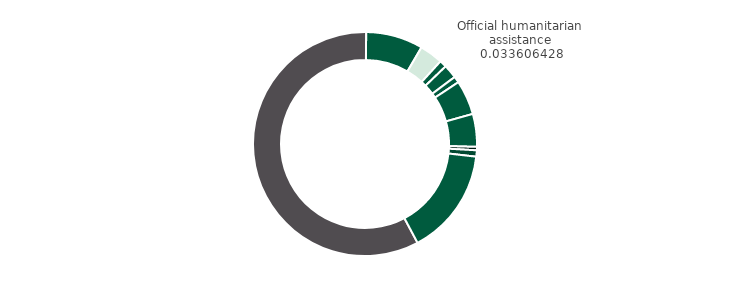
| Category | Series 0 |
|---|---|
| Government revenue | 0.58 |
| ODA gross (less humanitarian assistance) | 0.082 |
| Official humanitarian assistance | 0.034 |
| Other official flows gross | 0.01 |
| Peacekeeping | 0.02 |
| Long-term debt (official) | 0.009 |
| Foreign direct investment | 0.05 |
| Long-term debt (commercial) | 0.047 |
| Net short-term debt | 0.005 |
| Net portfolio equity | 0.009 |
| Remittances | 0.154 |